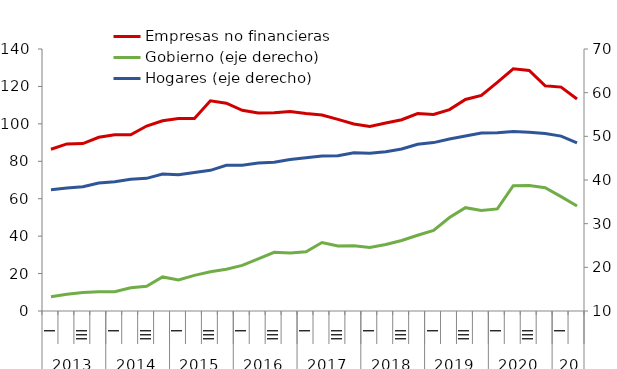
| Category | Empresas no financieras  |
|---|---|
| 0 | 86.416 |
| 1 | 89.277 |
| 2 | 89.489 |
| 3 | 92.835 |
| 4 | 94.115 |
| 5 | 94.154 |
| 6 | 98.837 |
| 7 | 101.652 |
| 8 | 102.915 |
| 9 | 102.891 |
| 10 | 112.309 |
| 11 | 111.061 |
| 12 | 107.236 |
| 13 | 105.842 |
| 14 | 105.94 |
| 15 | 106.547 |
| 16 | 105.526 |
| 17 | 104.752 |
| 18 | 102.37 |
| 19 | 99.96 |
| 20 | 98.663 |
| 21 | 100.506 |
| 22 | 102.205 |
| 23 | 105.524 |
| 24 | 105.053 |
| 25 | 107.613 |
| 26 | 113.03 |
| 27 | 115.153 |
| 28 | 122.189 |
| 29 | 129.419 |
| 30 | 128.524 |
| 31 | 120.301 |
| 32 | 119.636 |
| 33 | 113.298 |